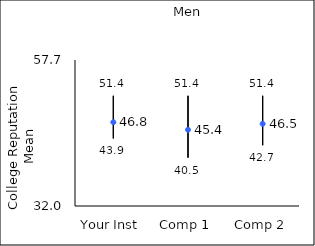
| Category | 25th percentile | 75th percentile | Mean |
|---|---|---|---|
| Your Inst | 43.9 | 51.4 | 46.75 |
| Comp 1 | 40.5 | 51.4 | 45.41 |
| Comp 2 | 42.7 | 51.4 | 46.47 |